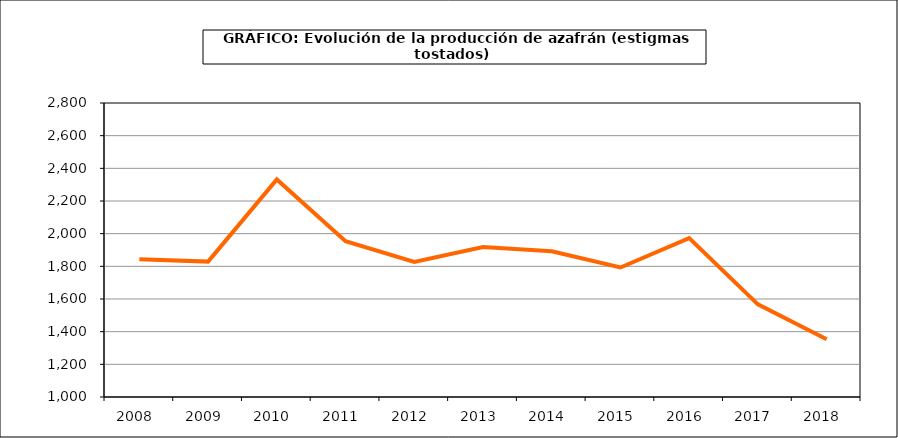
| Category | Producción |
|---|---|
| 2008.0 | 1843 |
| 2009.0 | 1829 |
| 2010.0 | 2332 |
| 2011.0 | 1954 |
| 2012.0 | 1827 |
| 2013.0 | 1918 |
| 2014.0 | 1892 |
| 2015.0 | 1793 |
| 2016.0 | 1973 |
| 2017.0 | 1567 |
| 2018.0 | 1354 |